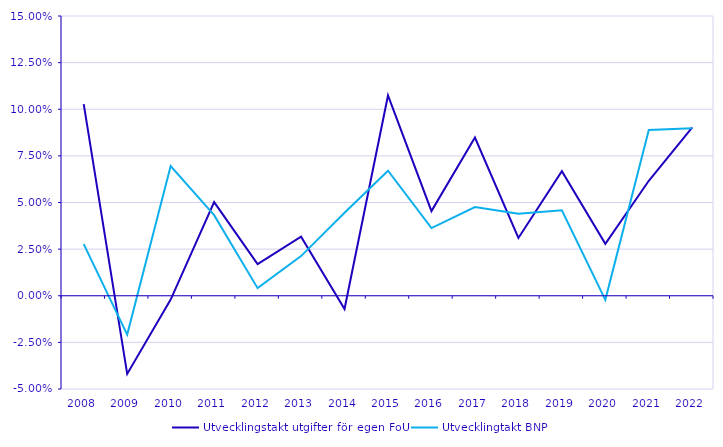
| Category | Utvecklingstakt utgifter för egen FoU | Utvecklingtakt BNP |
|---|---|---|
| 2008 | 0.103 | 0.028 |
| 2009 | -0.042 | -0.021 |
| 2010 | -0.002 | 0.07 |
| 2011 | 0.05 | 0.043 |
| 2012 | 0.017 | 0.004 |
| 2013 | 0.032 | 0.021 |
| 2014 | -0.007 | 0.044 |
| 2015 | 0.107 | 0.067 |
| 2016 | 0.045 | 0.036 |
| 2017 | 0.085 | 0.048 |
| 2018 | 0.031 | 0.044 |
| 2019 | 0.067 | 0.046 |
| 2020 | 0.028 | -0.002 |
| 2021 | 0.062 | 0.089 |
| 2022 | 0.09 | 0.09 |